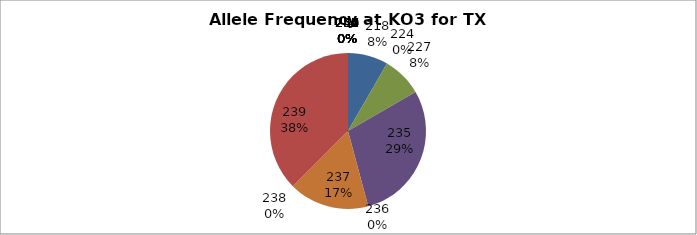
| Category | Series 0 |
|---|---|
| 218.0 | 0.083 |
| 224.0 | 0 |
| 227.0 | 0.083 |
| 235.0 | 0.292 |
| 236.0 | 0 |
| 237.0 | 0.167 |
| 238.0 | 0 |
| 239.0 | 0.375 |
| 240.0 | 0 |
| 241.0 | 0 |
| 247.0 | 0 |
| 249.0 | 0 |
| 250.0 | 0 |
| 251.0 | 0 |
| 252.0 | 0 |
| 254.0 | 0 |
| 255.0 | 0 |
| 256.0 | 0 |
| 257.0 | 0 |